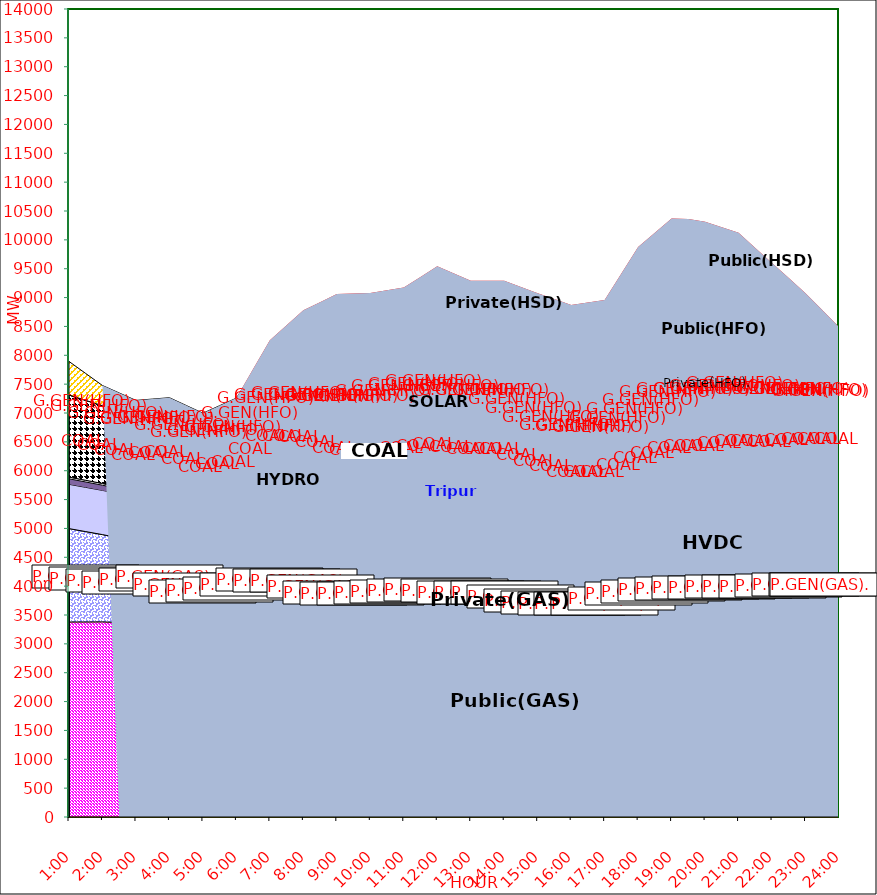
| Category | GAS | P.GEN(GAS). |  HVDC | TRIPURA | HYDRO | COAL | SOLAR | G.GEN(HFO) | P.GEN(HFO). | G.GEN(HSD) | P.GEN(HSD) | SHORTAGE | Total Energy Gen 193.080 MKWHr 
Energy Not Served   0.000 MKWHr 
Energy Requirement     193.080 MKWHr  |
|---|---|---|---|---|---|---|---|---|---|---|---|---|---|
| 1:00 | 3379 | 1618 | 767 | 96 | 30 | 1422 | 0 | 0 | 581 | 0 | 0 | 0 |  |
| 1:30 | 3380 | 1565 | 766.5 | 93 | 30 | 1384.5 | 0 | 0 | 465.5 | 0 | 0 | 0 |  |
| 2:00 | 3381 | 1512 | 766 | 90 | 30 | 1347 | 0 | 0 | 350 | 0 | 0 | 0 |  |
| 2:30 | 3370.5 | 1465 | 766 | 85 | 30 | 1298 | 0 | 0 | 332.5 | 0 | 0 | 0 |  |
| 3:00 | 3360 | 1418 | 766 | 80 | 30 | 1249 | 0 | 0 | 315 | 0 | 0 | 0 |  |
| 3:30 | 3410 | 1412 | 766 | 79 | 30 | 1224.5 | 0 | 0 | 320 | 0 | 0 | 0 |  |
| 4:00 | 3460 | 1406 | 766 | 78 | 30 | 1200 | 0 | 0 | 325 | 0 | 0 | 0 |  |
| 4:30 | 3331.5 | 1400.5 | 766 | 78 | 30 | 1199.5 | 0 | 0 | 325 | 0 | 0 | 0 |  |
| 5:00 | 3203 | 1395 | 766 | 78 | 30 | 1199 | 0 | 0 | 325 | 0 | 0 | 0 |  |
| 5:30 | 3217 | 1418.5 | 766.5 | 85 | 30 | 1199 | 0 | 4 | 407 | 0 | 0 | 0 |  |
| 6:00 | 3231 | 1442 | 767 | 92 | 30 | 1199 | 0 | 8 | 489 | 0 | 0 | 0 |  |
| 6:30 | 3255.5 | 1558 | 837 | 92 | 30 | 1233.5 | 2 | 15.5 | 682 | 0 | 0 | 54.834 |  |
| 7:00 | 3280 | 1674 | 907 | 92 | 30 | 1268 | 4 | 23 | 875 | 0 | 0 | 109.667 |  |
| 7:30 | 3264.5 | 1683 | 872.5 | 94 | 30 | 1324 | 30.5 | 31.5 | 936 | 0 | 0 | 254.815 |  |
| 8:00 | 3249 | 1692 | 838 | 96 | 30 | 1380 | 57 | 40 | 997 | 0 | 0 | 399.964 |  |
| 8:30 | 3164.5 | 1656.5 | 838 | 105 | 30 | 1415 | 95.5 | 48.5 | 1031.5 | 0 | 0 | 534.974 |  |
| 9:00 | 3080 | 1621 | 838 | 114 | 30 | 1450 | 134 | 57 | 1066 | 0 | 0 | 669.985 |  |
| 9:30 | 3098 | 1562.5 | 838 | 115 | 30 | 1441 | 174.5 | 75 | 1096.5 | 0 | 0 | 640.034 |  |
| 10:00 | 3116 | 1504 | 838 | 116 | 30 | 1432 | 215 | 93 | 1127 | 0 | 0 | 610.083 |  |
| 10:30 | 3114.5 | 1554.5 | 838 | 113 | 30 | 1418.5 | 242 | 148 | 1197 | 0 | 0 | 472.768 |  |
| 11:00 | 3113 | 1605 | 838 | 110 | 30 | 1405 | 269 | 203 | 1267 | 0 | 0 | 335.453 |  |
| 11:30 | 3124.5 | 1604.5 | 871 | 117 | 30 | 1370.5 | 279.5 | 238 | 1325.5 | 75 | 0 | 322.551 |  |
| 12:00 | 3136 | 1604 | 904 | 124 | 30 | 1336 | 290 | 273 | 1384 | 150 | 0 | 309.649 |  |
| 12:30 | 3101 | 1631.5 | 904 | 121 | 30 | 1270.5 | 287 | 274 | 1374 | 204 | 0 | 219.335 |  |
| 13:00 | 3066 | 1659 | 904 | 118 | 30 | 1205 | 284 | 275 | 1364 | 258 | 0 | 129.021 |  |
| 13:30 | 3066 | 1659 | 904 | 118 | 30 | 1205 | 284 | 275 | 1364 | 258 | 0 | 129.021 |  |
| 14:00 | 3066 | 1659 | 904 | 118 | 30 | 1205 | 284 | 275 | 1364 | 258 | 0 | 129.021 |  |
| 14:30 | 3019.5 | 1602 | 904 | 118 | 30 | 1203.5 | 227.5 | 295 | 1326.5 | 251.5 | 0 | 206.433 |  |
| 15:00 | 2973 | 1545 | 904 | 118 | 30 | 1202 | 171 | 315 | 1289 | 245 | 0 | 283.845 |  |
| 15:30 | 2994.5 | 1460.5 | 904 | 118 | 30 | 1152 | 129 | 317.5 | 1317.5 | 252 | 0 | 299.512 |  |
| 16:00 | 3016 | 1376 | 904 | 118 | 30 | 1102 | 87 | 320 | 1346 | 259 | 0 | 315.179 |  |
| 16:30 | 3025.5 | 1346.5 | 904.5 | 119 | 30 | 1131 | 52.5 | 344.5 | 1425 | 257 | 0 | 280.62 |  |
| 17:00 | 3035 | 1317 | 905 | 120 | 30 | 1160 | 18 | 369 | 1504 | 255 | 0 | 246.061 |  |
| 17:30 | 3127.5 | 1315 | 904.5 | 122 | 30 | 1217 | 9 | 394 | 1758.5 | 257.5 | 10 | 272.03 |  |
| 18:00 | 3220 | 1313 | 904 | 124 | 30 | 1274 | 0 | 419 | 2013 | 260 | 20 | 298 |  |
| 18:30 | 3227 | 1362.5 | 882 | 123 | 30 | 1382 | 0 | 440 | 2060.5 | 267 | 15 | 333 |  |
| 19:00 | 3234 | 1412 | 860 | 122 | 30 | 1490 | 0 | 461 | 2108 | 274 | 10 | 368 |  |
| 19:30 | 3264 | 1378 | 859 | 120 | 30 | 1574 | 0 | 414 | 2121 | 274 | 10 | 316.5 |  |
| 20:00 | 3296 | 1354 | 859 | 114 | 30 | 1571 | 0 | 413 | 2128 | 273 | 10 | 265 |  |
| 20:30 | 3297 | 1373 | 882.5 | 115 | 30 | 1572.5 | 0 | 414 | 2036.5 | 136.5 | 55 | 305 |  |
| 21:00 | 3298 | 1392 | 906 | 116 | 30 | 1574 | 0 | 415 | 1945 | 0 | 100 | 345 |  |
| 21:30 | 3295.5 | 1388.5 | 906.5 | 112 | 30 | 1574 | 0 | 331.5 | 1901 | 0 | 55 | 265.5 |  |
| 22:00 | 3293 | 1385 | 907 | 108 | 30 | 1574 | 0 | 248 | 1857 | 0 | 10 | 186 |  |
| 22:30 | 3300.5 | 1408 | 906.5 | 106 | 30 | 1574 | 0 | 203.5 | 1632.5 | 0 | 5 | 171.5 |  |
| 23:00 | 3308 | 1431 | 906 | 104 | 30 | 1574 | 0 | 159 | 1408 | 0 | 0 | 157 |  |
| 23:30 | 3312 | 1432 | 900.5 | 101 | 30 | 1574 | 0 | 118.5 | 1236.5 | 0 | 0 | 78.5 |  |
| 24:00 | 3316 | 1433 | 895 | 98 | 30 | 1574 | 0 | 78 | 1065 | 0 | 0 | 0 |  |